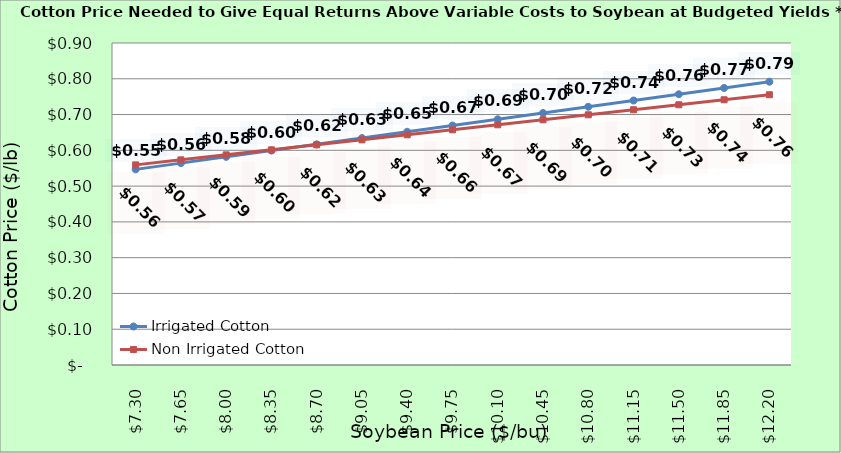
| Category | Irrigated Cotton | Non Irrigated Cotton |
|---|---|---|
| 7.3000000000000025 | 0.547 | 0.559 |
| 7.650000000000002 | 0.564 | 0.573 |
| 8.000000000000002 | 0.582 | 0.587 |
| 8.350000000000001 | 0.599 | 0.601 |
| 8.700000000000001 | 0.617 | 0.615 |
| 9.05 | 0.634 | 0.629 |
| 9.4 | 0.652 | 0.643 |
| 9.75 | 0.669 | 0.657 |
| 10.1 | 0.687 | 0.671 |
| 10.45 | 0.704 | 0.685 |
| 10.799999999999999 | 0.722 | 0.699 |
| 11.149999999999999 | 0.739 | 0.713 |
| 11.499999999999998 | 0.757 | 0.727 |
| 11.849999999999998 | 0.774 | 0.741 |
| 12.199999999999998 | 0.792 | 0.755 |